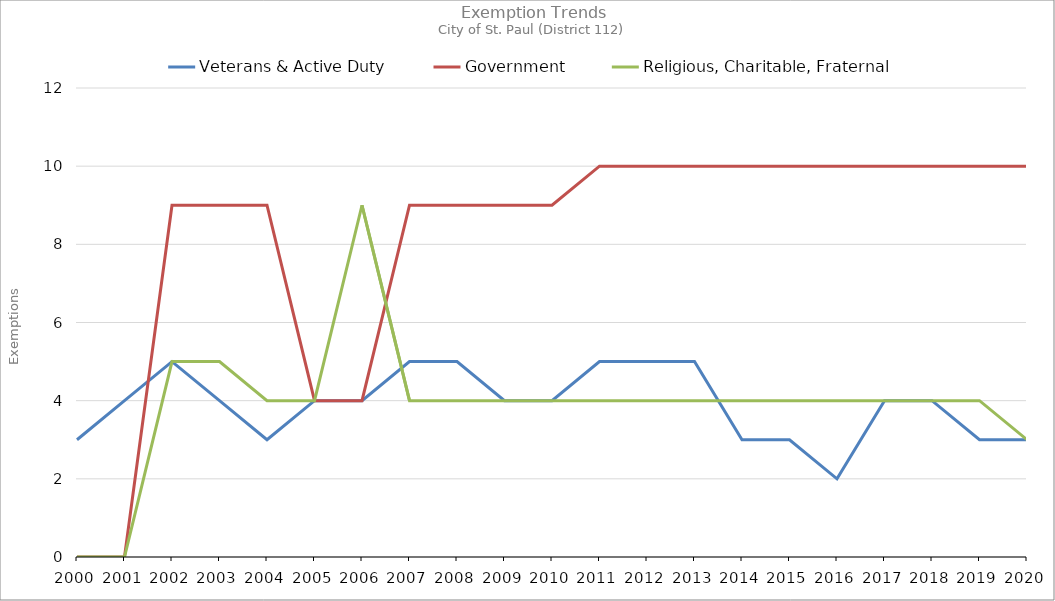
| Category | Veterans & Active Duty | Government | Religious, Charitable, Fraternal |
|---|---|---|---|
| 2000.0 | 3 | 0 | 0 |
| 2001.0 | 4 | 0 | 0 |
| 2002.0 | 5 | 9 | 5 |
| 2003.0 | 4 | 9 | 5 |
| 2004.0 | 3 | 9 | 4 |
| 2005.0 | 4 | 4 | 4 |
| 2006.0 | 4 | 4 | 9 |
| 2007.0 | 5 | 9 | 4 |
| 2008.0 | 5 | 9 | 4 |
| 2009.0 | 4 | 9 | 4 |
| 2010.0 | 4 | 9 | 4 |
| 2011.0 | 5 | 10 | 4 |
| 2012.0 | 5 | 10 | 4 |
| 2013.0 | 5 | 10 | 4 |
| 2014.0 | 3 | 10 | 4 |
| 2015.0 | 3 | 10 | 4 |
| 2016.0 | 2 | 10 | 4 |
| 2017.0 | 4 | 10 | 4 |
| 2018.0 | 4 | 10 | 4 |
| 2019.0 | 3 | 10 | 4 |
| 2020.0 | 3 | 10 | 3 |